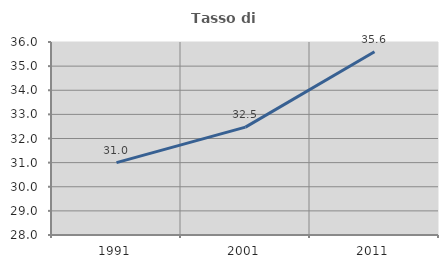
| Category | Tasso di occupazione   |
|---|---|
| 1991.0 | 31.001 |
| 2001.0 | 32.473 |
| 2011.0 | 35.596 |